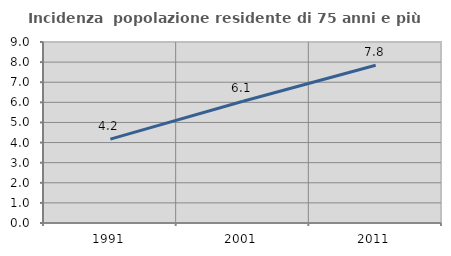
| Category | Incidenza  popolazione residente di 75 anni e più |
|---|---|
| 1991.0 | 4.171 |
| 2001.0 | 6.051 |
| 2011.0 | 7.842 |